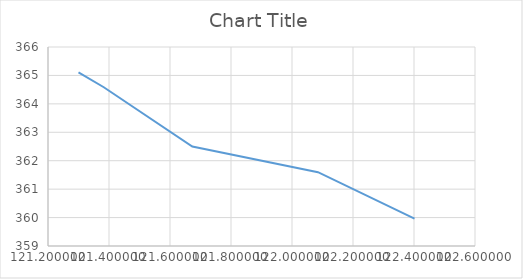
| Category | Series 0 |
|---|---|
| 121.3 | 365.104 |
| 121.382907 | 364.584 |
| 121.67319867520678 | 362.5 |
| 122.08514082346687 | 361.597 |
| 122.40161634502573 | 359.962 |